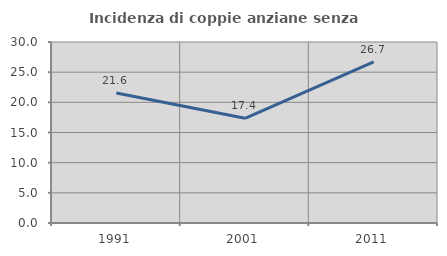
| Category | Incidenza di coppie anziane senza figli  |
|---|---|
| 1991.0 | 21.552 |
| 2001.0 | 17.355 |
| 2011.0 | 26.724 |